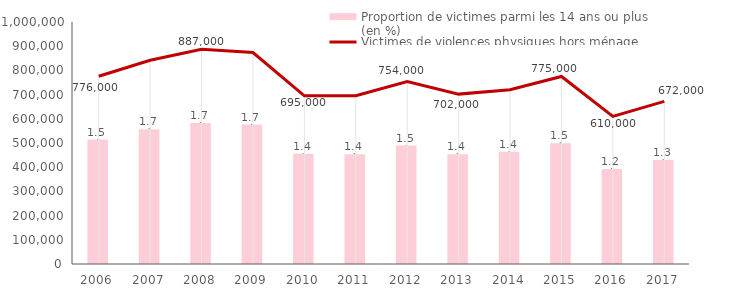
| Category | Proportion de victimes parmi les 14 ans ou plus 
(en %) |
|---|---|
| 2006.0 | 1.542 |
| 2007.0 | 1.671 |
| 2008.0 | 1.748 |
| 2009.0 | 1.728 |
| 2010.0 | 1.367 |
| 2011.0 | 1.361 |
| 2012.0 | 1.469 |
| 2013.0 | 1.361 |
| 2014.0 | 1.391 |
| 2015.0 | 1.497 |
| 2016.0 | 1.177 |
| 2017.0 | 1.288 |